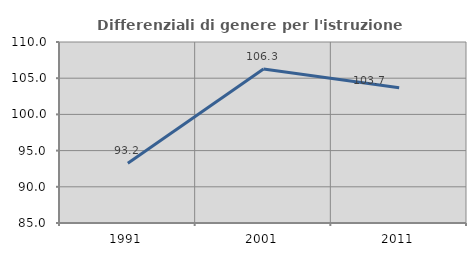
| Category | Differenziali di genere per l'istruzione superiore |
|---|---|
| 1991.0 | 93.241 |
| 2001.0 | 106.261 |
| 2011.0 | 103.681 |